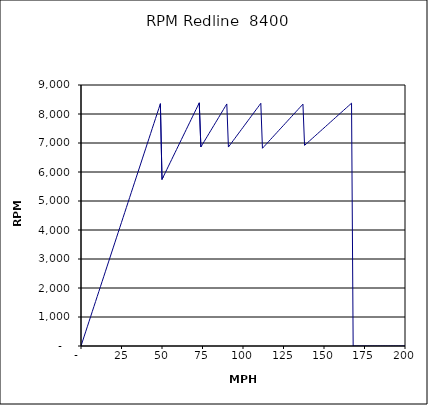
| Category | RPM Redline  8400 |
|---|---|
| 0.0 | 0 |
| 1.0 | 170.523 |
| 2.0 | 341.047 |
| 3.0 | 511.57 |
| 4.0 | 682.093 |
| 5.0 | 852.617 |
| 6.0 | 1023.14 |
| 7.0 | 1193.663 |
| 8.0 | 1364.187 |
| 9.0 | 1534.71 |
| 10.0 | 1705.234 |
| 11.0 | 1875.757 |
| 12.0 | 2046.28 |
| 13.0 | 2216.804 |
| 14.0 | 2387.327 |
| 15.0 | 2557.85 |
| 16.0 | 2728.374 |
| 17.0 | 2898.897 |
| 18.0 | 3069.42 |
| 19.0 | 3239.944 |
| 20.0 | 3410.467 |
| 21.0 | 3580.99 |
| 22.0 | 3751.514 |
| 23.0 | 3922.037 |
| 24.0 | 4092.56 |
| 25.0 | 4263.084 |
| 26.0 | 4433.607 |
| 27.0 | 4604.131 |
| 28.0 | 4774.654 |
| 29.0 | 4945.177 |
| 30.0 | 5115.701 |
| 31.0 | 5286.224 |
| 32.0 | 5456.747 |
| 33.0 | 5627.271 |
| 34.0 | 5797.794 |
| 35.0 | 5968.317 |
| 36.0 | 6138.841 |
| 37.0 | 6309.364 |
| 38.0 | 6479.887 |
| 39.0 | 6650.411 |
| 40.0 | 6820.934 |
| 41.0 | 6991.458 |
| 42.0 | 7161.981 |
| 43.0 | 7332.504 |
| 44.0 | 7503.028 |
| 45.0 | 7673.551 |
| 46.0 | 7844.074 |
| 47.0 | 8014.598 |
| 48.0 | 8185.121 |
| 49.0 | 8355.644 |
| 50.0 | 5743.945 |
| 51.0 | 5858.823 |
| 52.0 | 5973.702 |
| 53.0 | 6088.581 |
| 54.0 | 6203.46 |
| 55.0 | 6318.339 |
| 56.0 | 6433.218 |
| 57.0 | 6548.097 |
| 58.0 | 6662.976 |
| 59.0 | 6777.855 |
| 60.0 | 6892.733 |
| 61.0 | 7007.612 |
| 62.0 | 7122.491 |
| 63.0 | 7237.37 |
| 64.0 | 7352.249 |
| 65.0 | 7467.128 |
| 66.0 | 7582.007 |
| 67.0 | 7696.886 |
| 68.0 | 7811.765 |
| 69.0 | 7926.643 |
| 70.0 | 8041.522 |
| 71.0 | 8156.401 |
| 72.0 | 8271.28 |
| 73.0 | 8386.159 |
| 74.0 | 6862.817 |
| 75.0 | 6955.558 |
| 76.0 | 7048.299 |
| 77.0 | 7141.039 |
| 78.0 | 7233.78 |
| 79.0 | 7326.521 |
| 80.0 | 7419.262 |
| 81.0 | 7512.002 |
| 82.0 | 7604.743 |
| 83.0 | 7697.484 |
| 84.0 | 7790.225 |
| 85.0 | 7882.966 |
| 86.0 | 7975.706 |
| 87.0 | 8068.447 |
| 88.0 | 8161.188 |
| 89.0 | 8253.929 |
| 90.0 | 8346.669 |
| 91.0 | 6860.424 |
| 92.0 | 6935.813 |
| 93.0 | 7011.202 |
| 94.0 | 7086.592 |
| 95.0 | 7161.981 |
| 96.0 | 7237.37 |
| 97.0 | 7312.759 |
| 98.0 | 7388.149 |
| 99.0 | 7463.538 |
| 100.0 | 7538.927 |
| 101.0 | 7614.317 |
| 102.0 | 7689.706 |
| 103.0 | 7765.095 |
| 104.0 | 7840.484 |
| 105.0 | 7915.874 |
| 106.0 | 7991.263 |
| 107.0 | 8066.652 |
| 108.0 | 8142.041 |
| 109.0 | 8217.431 |
| 110.0 | 8292.82 |
| 111.0 | 8368.209 |
| 112.0 | 6817.812 |
| 113.0 | 6878.686 |
| 114.0 | 6939.559 |
| 115.0 | 7000.432 |
| 116.0 | 7061.306 |
| 117.0 | 7122.179 |
| 118.0 | 7183.052 |
| 119.0 | 7243.926 |
| 120.0 | 7304.799 |
| 121.0 | 7365.672 |
| 122.0 | 7426.546 |
| 123.0 | 7487.419 |
| 124.0 | 7548.292 |
| 125.0 | 7609.166 |
| 126.0 | 7670.039 |
| 127.0 | 7730.912 |
| 128.0 | 7791.786 |
| 129.0 | 7852.659 |
| 130.0 | 7913.532 |
| 131.0 | 7974.406 |
| 132.0 | 8035.279 |
| 133.0 | 8096.152 |
| 134.0 | 8157.026 |
| 135.0 | 8217.899 |
| 136.0 | 8278.772 |
| 137.0 | 8339.646 |
| 138.0 | 6918.73 |
| 139.0 | 6968.865 |
| 140.0 | 7019.001 |
| 141.0 | 7069.137 |
| 142.0 | 7119.273 |
| 143.0 | 7169.408 |
| 144.0 | 7219.544 |
| 145.0 | 7269.68 |
| 146.0 | 7319.816 |
| 147.0 | 7369.951 |
| 148.0 | 7420.087 |
| 149.0 | 7470.223 |
| 150.0 | 7520.358 |
| 151.0 | 7570.494 |
| 152.0 | 7620.63 |
| 153.0 | 7670.766 |
| 154.0 | 7720.901 |
| 155.0 | 7771.037 |
| 156.0 | 7821.173 |
| 157.0 | 7871.309 |
| 158.0 | 7921.444 |
| 159.0 | 7971.58 |
| 160.0 | 8021.716 |
| 161.0 | 8071.851 |
| 162.0 | 8121.987 |
| 163.0 | 8172.123 |
| 164.0 | 8222.259 |
| 165.0 | 8272.394 |
| 166.0 | 8322.53 |
| 167.0 | 8372.666 |
| 168.0 | 0 |
| 169.0 | 0 |
| 170.0 | 0 |
| 171.0 | 0 |
| 172.0 | 0 |
| 173.0 | 0 |
| 174.0 | 0 |
| 175.0 | 0 |
| 176.0 | 0 |
| 177.0 | 0 |
| 178.0 | 0 |
| 179.0 | 0 |
| 180.0 | 0 |
| 181.0 | 0 |
| 182.0 | 0 |
| 183.0 | 0 |
| 184.0 | 0 |
| 185.0 | 0 |
| 186.0 | 0 |
| 187.0 | 0 |
| 188.0 | 0 |
| 189.0 | 0 |
| 190.0 | 0 |
| 191.0 | 0 |
| 192.0 | 0 |
| 193.0 | 0 |
| 194.0 | 0 |
| 195.0 | 0 |
| 196.0 | 0 |
| 197.0 | 0 |
| 198.0 | 0 |
| 199.0 | 0 |
| 200.0 | 0 |